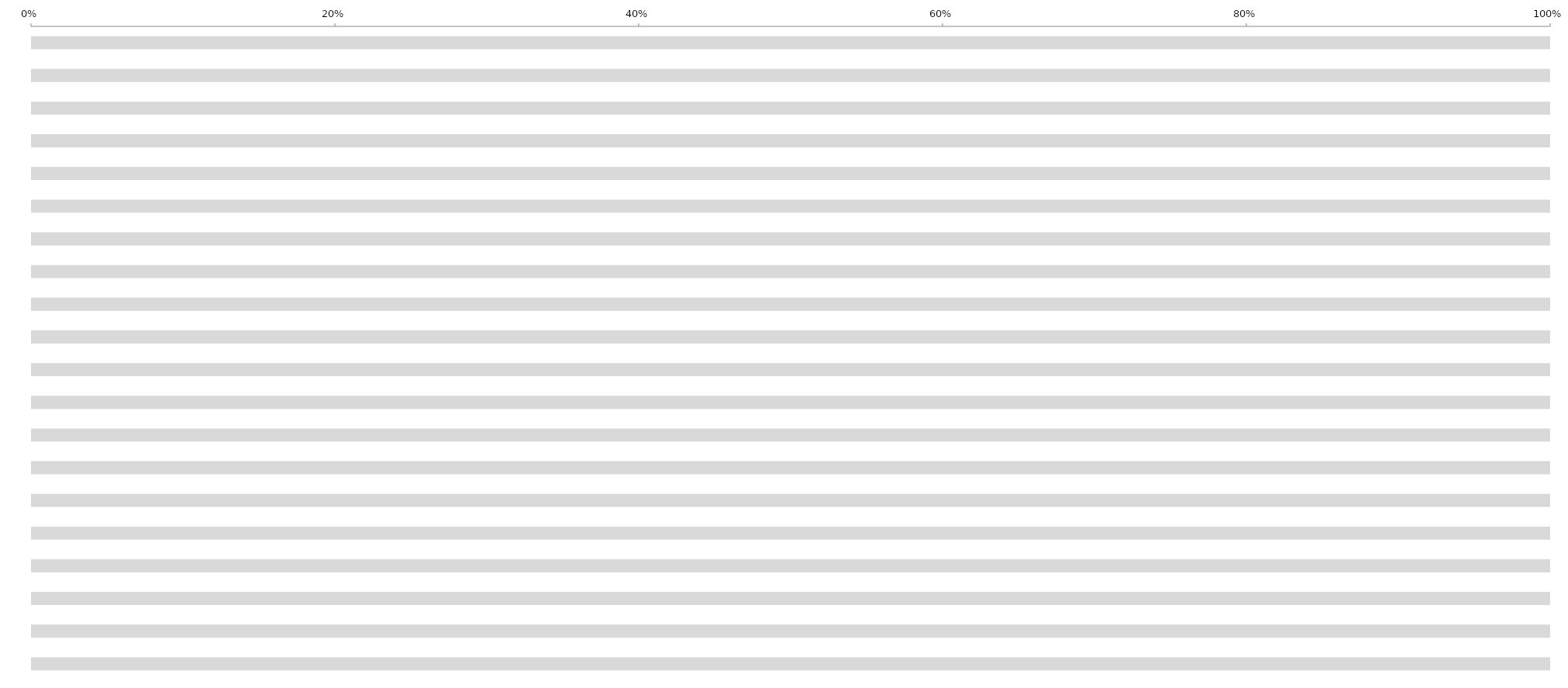
| Category | % YES | % NO | % UNANSWERED |
|---|---|---|---|
| PRODUCTION  | 0 | 0 | 1 |
| ACCOUNTING  | 0 | 0 | 1 |
| ART | 0 | 0 | 1 |
| ASSISTANT DIRECTORS | 0 | 0 | 1 |
| CAMERA | 0 | 0 | 1 |
| CATERING | 0 | 0 | 1 |
| LOCATION | 0 | 0 | 1 |
| COSTUME/WARDROBE | 0 | 0 | 1 |
| CRAFT SERVICE | 0 | 0 | 1 |
| ELECTRIC | 0 | 0 | 1 |
| GREEN | 0 | 0 | 1 |
| GRIP | 0 | 0 | 1 |
| HAIR | 0 | 0 | 1 |
| CONSTRUCTION | 0 | 0 | 1 |
| MAKE UP | 0 | 0 | 1 |
| PROP | 0 | 0 | 1 |
| SET DECORATION | 0 | 0 | 1 |
| SPECIAL EFFECTS | 0 | 0 | 1 |
| SOUND | 0 | 0 | 1 |
| TRANSPORTATION | 0 | 0 | 1 |